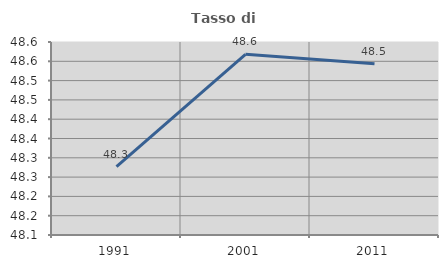
| Category | Tasso di occupazione   |
|---|---|
| 1991.0 | 48.277 |
| 2001.0 | 48.568 |
| 2011.0 | 48.544 |